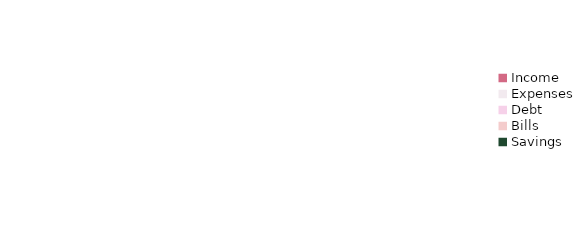
| Category | Series 0 |
|---|---|
| Income | 0 |
| Expenses | 0 |
| Debt | 0 |
| Bills | 0 |
| Savings | 0 |